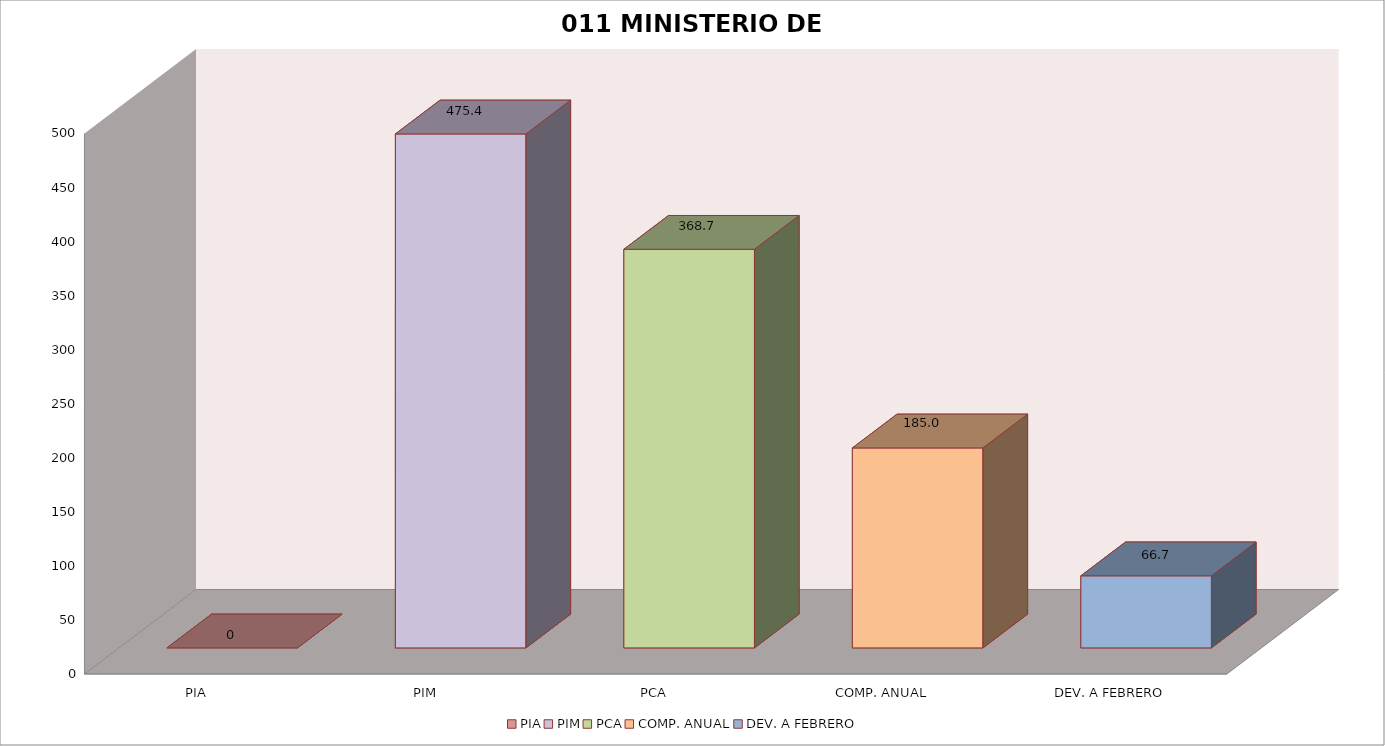
| Category | 011 MINISTERIO DE SALUD |
|---|---|
| PIA | 0 |
| PIM | 475.409 |
| PCA | 368.728 |
| COMP. ANUAL | 184.969 |
| DEV. A FEBRERO | 66.672 |